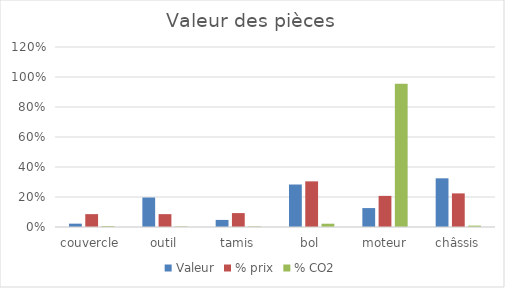
| Category | Valeur | % prix | % CO2 |
|---|---|---|---|
| couvercle | 0.022 | 0.086 | 0.006 |
| outil | 0.196 | 0.086 | 0.004 |
| tamis | 0.047 | 0.093 | 0.004 |
| bol | 0.283 | 0.304 | 0.022 |
| moteur | 0.126 | 0.207 | 0.955 |
| châssis | 0.325 | 0.224 | 0.009 |